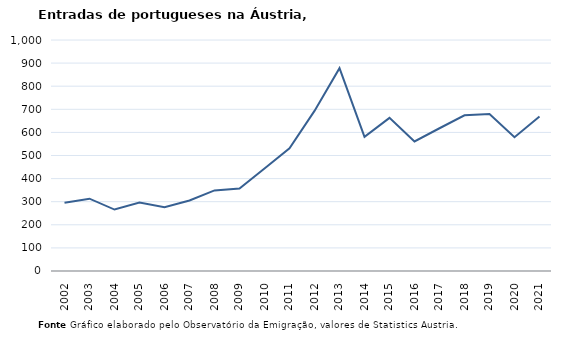
| Category | Entradas |
|---|---|
| 2002.0 | 295 |
| 2003.0 | 313 |
| 2004.0 | 266 |
| 2005.0 | 296 |
| 2006.0 | 276 |
| 2007.0 | 305 |
| 2008.0 | 349 |
| 2009.0 | 357 |
| 2010.0 | 444 |
| 2011.0 | 531 |
| 2012.0 | 693 |
| 2013.0 | 878 |
| 2014.0 | 581 |
| 2015.0 | 663 |
| 2016.0 | 561 |
| 2017.0 | 618 |
| 2018.0 | 674 |
| 2019.0 | 680 |
| 2020.0 | 579 |
| 2021.0 | 669 |